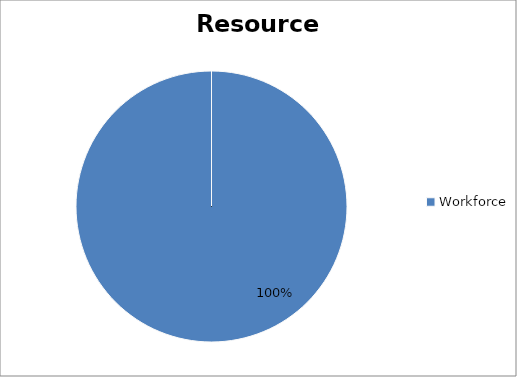
| Category | data |
|---|---|
| Workforce | 124124 |